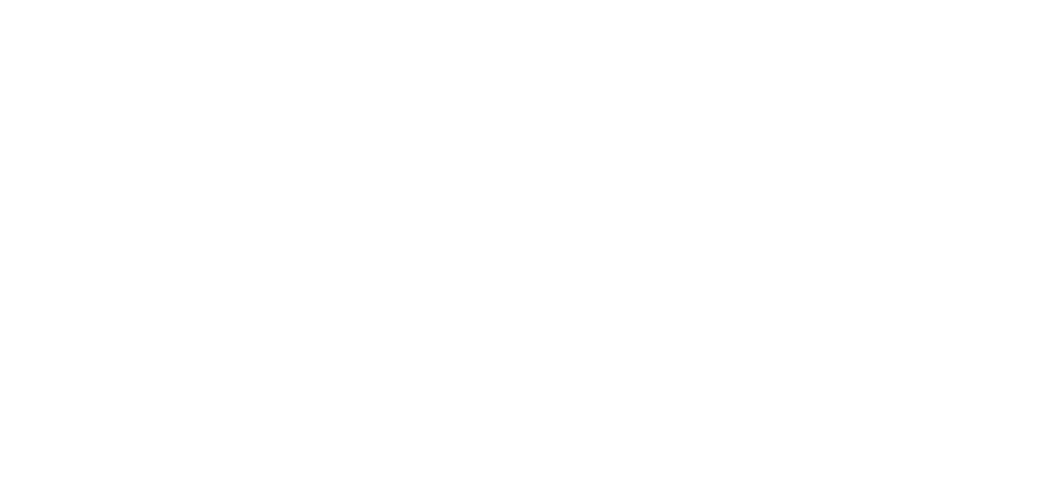
| Category | Total |
|---|---|
| Al Hodeidah | 570 |
| Hajjah | 447 |
| Taiz | 194 |
| Al Jawf | 164 |
| Marib | 155 |
| Amran | 147 |
| Hadramawt | 126 |
| Ad Dali | 90 |
| Lahj | 77 |
| Ibb | 70 |
| Abyan | 64 |
| Sanaa | 51 |
| Al Bayda | 33 |
| Aden | 28 |
| Sadah | 18 |
| Shabwah | 17 |
| Dhamar | 16 |
| Al Mahwit | 9 |
| Raymah | 8 |
| Sanaa City | 4 |
| Al Maharah | 2 |
| Socotra | 1 |